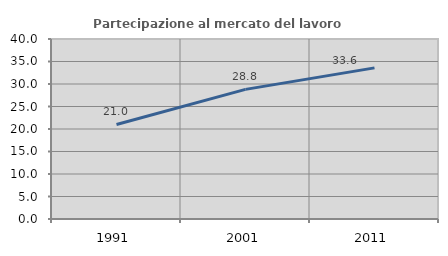
| Category | Partecipazione al mercato del lavoro  femminile |
|---|---|
| 1991.0 | 21.006 |
| 2001.0 | 28.804 |
| 2011.0 | 33.586 |